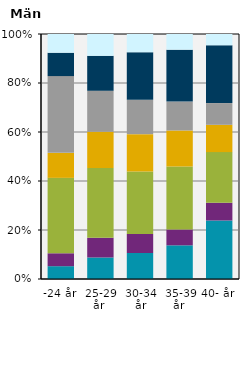
| Category | Pedagogik och lärarutbildning | Humaniora och konst | Samhällsvetenskap, juridik, handel, administration | Naturvetenskap, matematik och data | Teknik och tillverkning | Hälso- och sjukvård samt social omsorg | Övriga |
|---|---|---|---|---|---|---|---|
| -24 år | 5.245 | 5.286 | 30.886 | 10.227 | 31.441 | 9.557 | 7.673 |
| 25-29 år  | 8.838 | 8.101 | 28.614 | 14.911 | 16.842 | 14.358 | 8.963 |
| 30-34 år | 10.645 | 7.808 | 25.575 | 15.3 | 14.076 | 19.473 | 7.474 |
| 35-39 år  | 13.801 | 6.49 | 25.774 | 14.808 | 11.824 | 21.298 | 6.416 |
| 40- år | 23.96 | 7.252 | 20.747 | 11.169 | 8.905 | 23.654 | 4.621 |